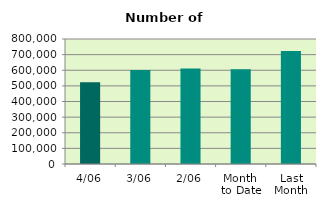
| Category | Series 0 |
|---|---|
| 4/06 | 523734 |
| 3/06 | 601792 |
| 2/06 | 611980 |
| Month 
to Date | 606055.5 |
| Last
Month | 723791.905 |